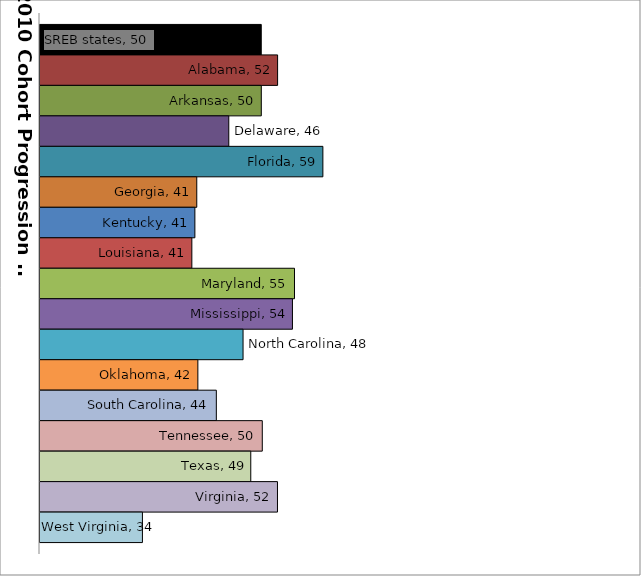
| Category | SREB states | Alabama | Arkansas | Delaware | Florida | Georgia | Kentucky | Louisiana | Maryland | Mississippi | North Carolina | Oklahoma | South Carolina | Tennessee | Texas | Virginia | West Virginia |
|---|---|---|---|---|---|---|---|---|---|---|---|---|---|---|---|---|---|
| 0 | 50.205 | 52.437 | 50.212 | 45.774 | 58.619 | 41.403 | 41.144 | 40.731 | 54.744 | 54.464 | 47.721 | 41.552 | 44.073 | 50.347 | 48.774 | 52.42 | 33.983 |